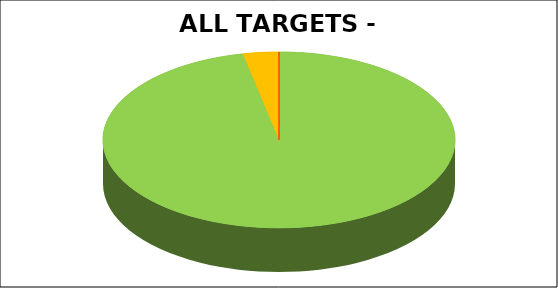
| Category | Series 0 |
|---|---|
| Green | 0.967 |
| Amber | 0.033 |
| Red | 0 |